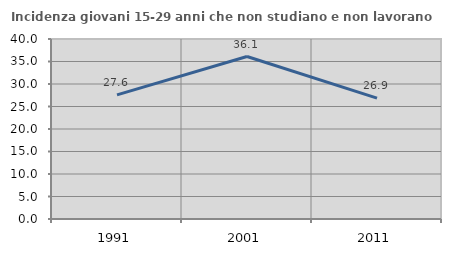
| Category | Incidenza giovani 15-29 anni che non studiano e non lavorano  |
|---|---|
| 1991.0 | 27.577 |
| 2001.0 | 36.111 |
| 2011.0 | 26.852 |